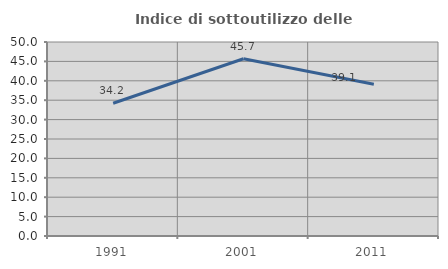
| Category | Indice di sottoutilizzo delle abitazioni  |
|---|---|
| 1991.0 | 34.221 |
| 2001.0 | 45.677 |
| 2011.0 | 39.116 |